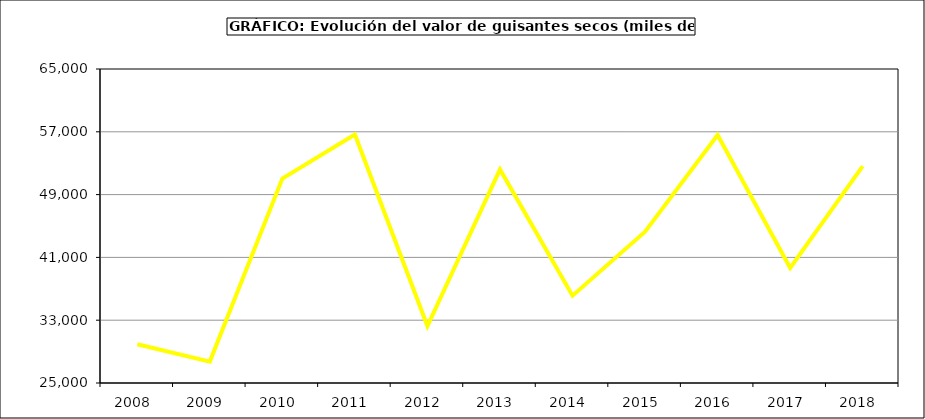
| Category | Valor |
|---|---|
| 2008.0 | 29934.579 |
| 2009.0 | 27725.625 |
| 2010.0 | 51044.567 |
| 2011.0 | 56666.277 |
| 2012.0 | 32251.03 |
| 2013.0 | 52203.832 |
| 2014.0 | 36116.283 |
| 2015.0 | 44267 |
| 2016.0 | 56599 |
| 2017.0 | 39648.556 |
| 2018.0 | 52618.427 |